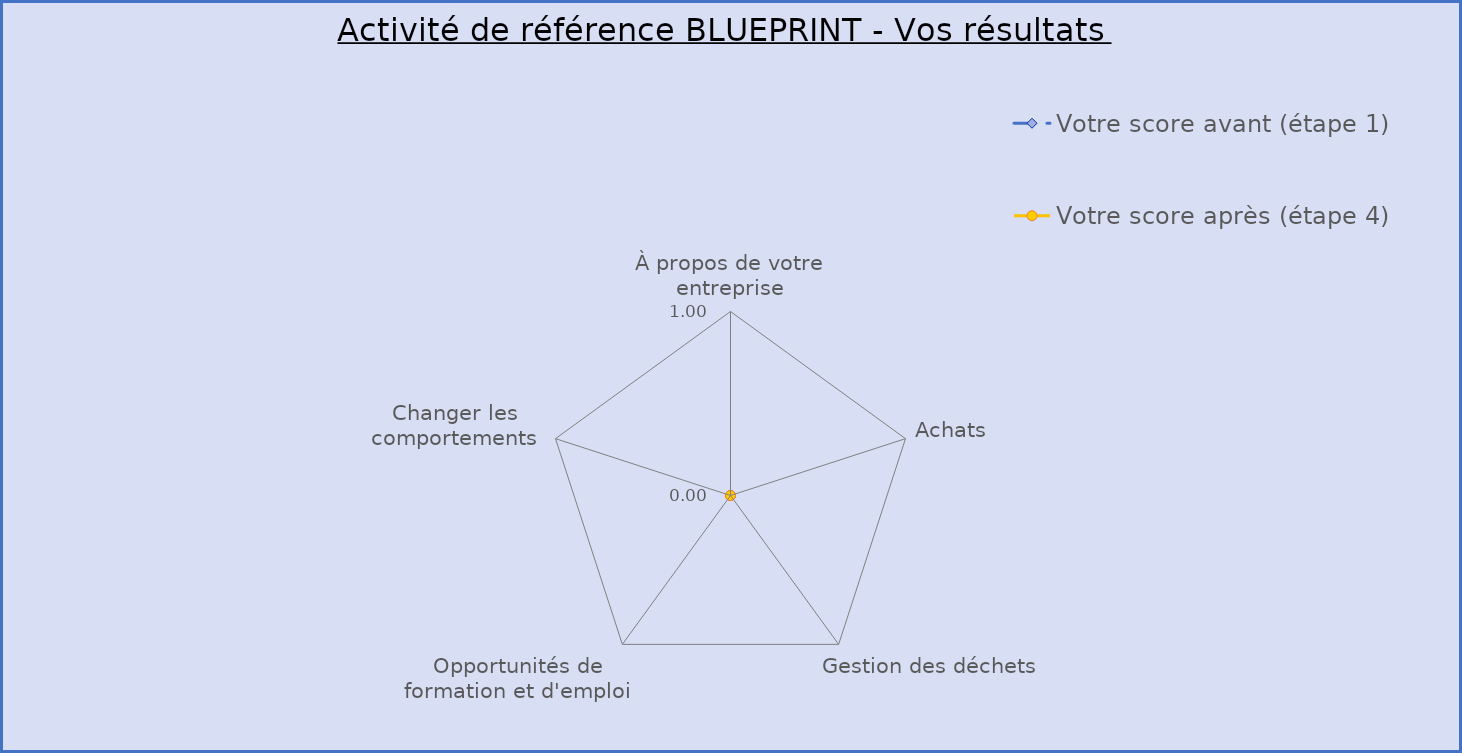
| Category | Votre score avant (étape 1) | Votre score après (étape 4) |
|---|---|---|
| À propos de votre entreprise | 0 | 0 |
| Achats | 0 | 0 |
| Gestion des déchets | 0 | 0 |
| Opportunités de formation et d'emploi | 0 | 0 |
| Changer les comportements | 0 | 0 |